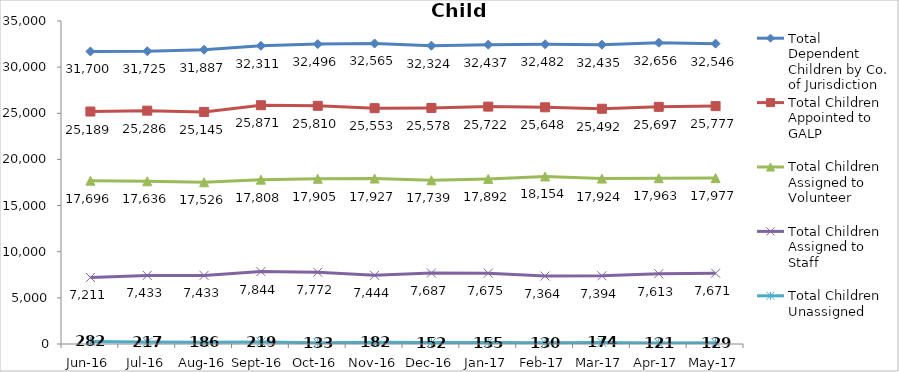
| Category | Total Dependent Children by Co. of Jurisdiction | Total Children Appointed to GALP | Total Children Assigned to Volunteer | Total Children Assigned to Staff | Total Children Unassigned |
|---|---|---|---|---|---|
| Jun-16 | 31700 | 25189 | 17696 | 7211 | 282 |
| Jul-16 | 31725 | 25286 | 17636 | 7433 | 217 |
| Aug-16 | 31887 | 25145 | 17526 | 7433 | 186 |
| Sep-16 | 32311 | 25871 | 17808 | 7844 | 219 |
| Oct-16 | 32496 | 25810 | 17905 | 7772 | 133 |
| Nov-16 | 32565 | 25553 | 17927 | 7444 | 182 |
| Dec-16 | 32324 | 25578 | 17739 | 7687 | 152 |
| Jan-17 | 32437 | 25722 | 17892 | 7675 | 155 |
| Feb-17 | 32482 | 25648 | 18154 | 7364 | 130 |
| Mar-17 | 32435 | 25492 | 17924 | 7394 | 174 |
| Apr-17 | 32656 | 25697 | 17963 | 7613 | 121 |
| May-17 | 32546 | 25777 | 17977 | 7671 | 129 |